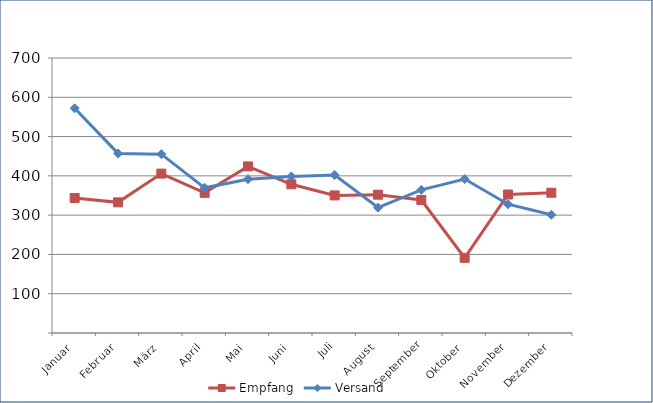
| Category | Empfang | Versand |
|---|---|---|
| Januar | 343.572 | 572.088 |
| Februar | 332.565 | 457.144 |
| März | 405.731 | 455.236 |
| April | 356.788 | 369.516 |
| Mai | 424.071 | 391.59 |
| Juni | 378.509 | 398.544 |
| Juli | 350.247 | 402.276 |
| August | 352.038 | 319.277 |
| September | 338.59 | 364.295 |
| Oktober | 191.329 | 391.895 |
| November | 352.582 | 327.883 |
| Dezember | 356.989 | 301.006 |